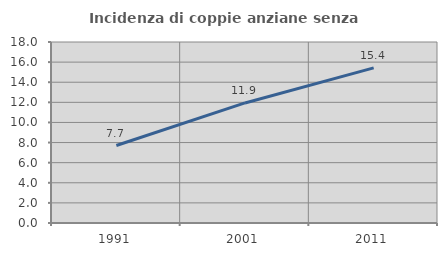
| Category | Incidenza di coppie anziane senza figli  |
|---|---|
| 1991.0 | 7.706 |
| 2001.0 | 11.941 |
| 2011.0 | 15.426 |